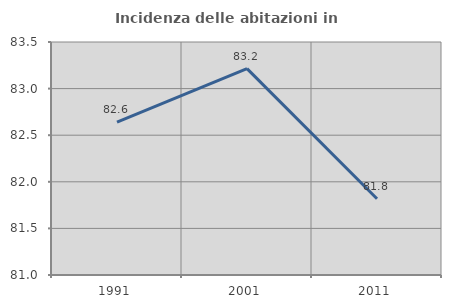
| Category | Incidenza delle abitazioni in proprietà  |
|---|---|
| 1991.0 | 82.64 |
| 2001.0 | 83.214 |
| 2011.0 | 81.818 |